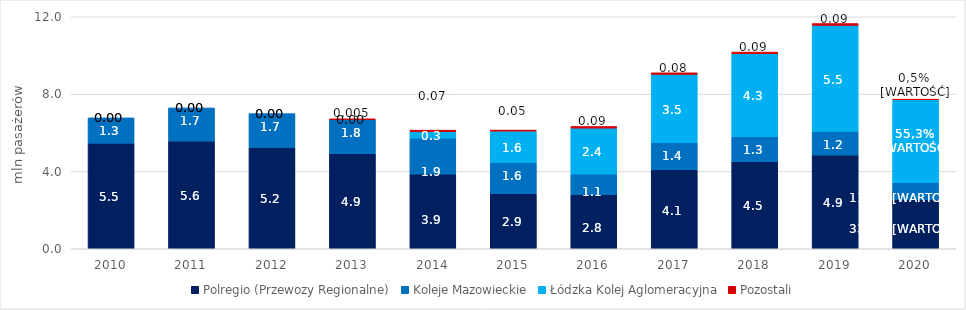
| Category | Polregio (Przewozy Regionalne) | Koleje Mazowieckie | Łódzka Kolej Aglomeracyjna | Pozostali |
|---|---|---|---|---|
| 2010 | 5.462 | 1.31 | 0 | 0 |
| 2011 | 5.572 | 1.713 | 0 | 0 |
| 2012 | 5.243 | 1.747 | 0 | 0 |
| 2013 | 4.919 | 1.777 | 0 | 0.005 |
| 2014 | 3.867 | 1.858 | 0.341 | 0.07 |
| 2015 | 2.857 | 1.605 | 1.625 | 0.054 |
| 2016 | 2.794 | 1.071 | 2.376 | 0.085 |
| 2017 | 4.082 | 1.399 | 3.541 | 0.079 |
| 2018 | 4.506 | 1.291 | 4.288 | 0.089 |
| 2019 | 4.852 | 1.219 | 5.485 | 0.093 |
| 2020 | 2.55 | 0.873 | 4.279 | 0.036 |